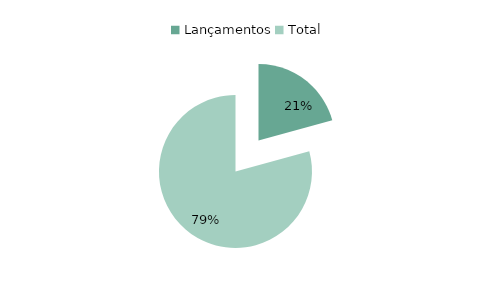
| Category | Series 0 |
|---|---|
| Lançamentos | 33997838.8 |
| Total | 129973409.26 |